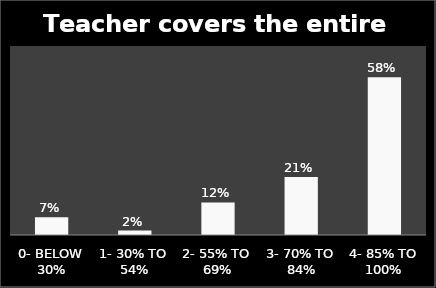
| Category | Series 0 |
|---|---|
| 0- BELOW 30% | 0.066 |
| 1- 30% TO 54% | 0.016 |
| 2- 55% TO 69% | 0.121 |
| 3- 70% TO 84% | 0.214 |
| 4- 85% TO 100% | 0.584 |